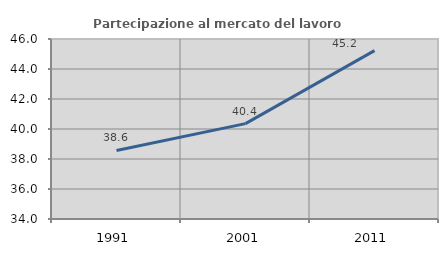
| Category | Partecipazione al mercato del lavoro  femminile |
|---|---|
| 1991.0 | 38.572 |
| 2001.0 | 40.359 |
| 2011.0 | 45.223 |